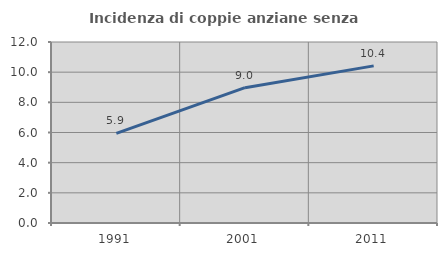
| Category | Incidenza di coppie anziane senza figli  |
|---|---|
| 1991.0 | 5.937 |
| 2001.0 | 8.972 |
| 2011.0 | 10.417 |